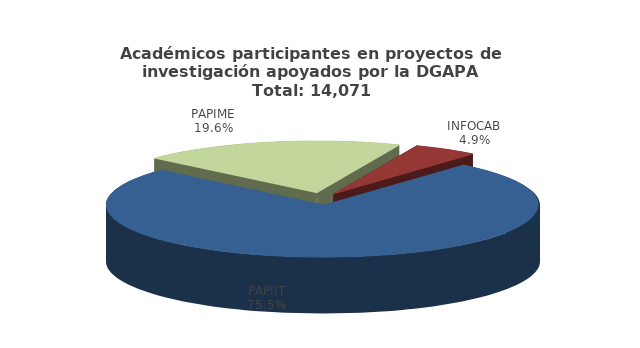
| Category | Series 0 |
|---|---|
| PAPIIT | 10623 |
| PAPIME | 2764 |
| INFOCAB | 684 |